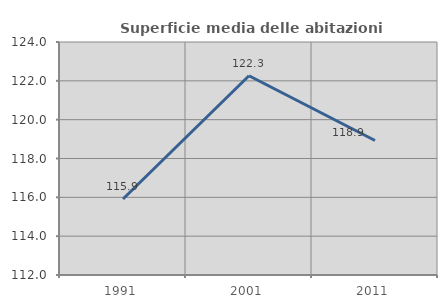
| Category | Superficie media delle abitazioni occupate |
|---|---|
| 1991.0 | 115.916 |
| 2001.0 | 122.261 |
| 2011.0 | 118.927 |